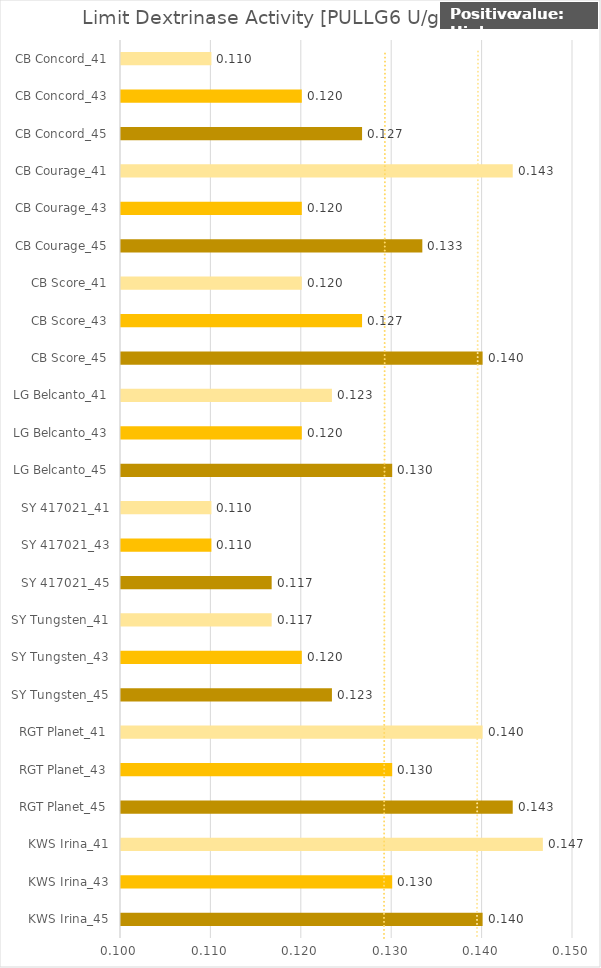
| Category |   Limit Dextrinase Activity [PULLG6 U/g dm] |
|---|---|
| KWS Irina_45 | 0.14 |
| KWS Irina_43 | 0.13 |
| KWS Irina_41 | 0.147 |
| RGT Planet_45 | 0.143 |
| RGT Planet_43 | 0.13 |
| RGT Planet_41 | 0.14 |
| SY Tungsten_45 | 0.123 |
| SY Tungsten_43 | 0.12 |
| SY Tungsten_41 | 0.117 |
| SY 417021_45 | 0.117 |
| SY 417021_43 | 0.11 |
| SY 417021_41 | 0.11 |
| LG Belcanto_45 | 0.13 |
| LG Belcanto_43 | 0.12 |
| LG Belcanto_41 | 0.123 |
| CB Score_45 | 0.14 |
| CB Score_43 | 0.127 |
| CB Score_41 | 0.12 |
| CB Courage_45 | 0.133 |
| CB Courage_43 | 0.12 |
| CB Courage_41 | 0.143 |
| CB Concord_45 | 0.127 |
| CB Concord_43 | 0.12 |
| CB Concord_41 | 0.11 |